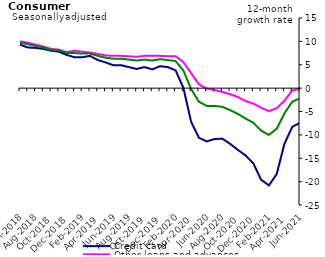
| Category | Credit card | Other loans and advances | Total |
|---|---|---|---|
| Jun-2018 | 9.3 | 10 | 9.7 |
| Jul-2018 | 8.7 | 9.7 | 9.4 |
| Aug-2018 | 8.6 | 9.3 | 9 |
| Sep-2018 | 8.4 | 8.9 | 8.7 |
| Oct-2018 | 8 | 8.4 | 8.2 |
| Nov-2018 | 7.8 | 8.2 | 8.1 |
| Dec-2018 | 7.1 | 7.7 | 7.5 |
| Jan-2019 | 6.6 | 8 | 7.5 |
| Feb-2019 | 6.6 | 7.8 | 7.4 |
| Mar-2019 | 6.9 | 7.6 | 7.4 |
| Apr-2019 | 6 | 7.3 | 6.9 |
| May-2019 | 5.5 | 7 | 6.5 |
| Jun-2019 | 4.9 | 6.9 | 6.3 |
| Jul-2019 | 4.9 | 6.9 | 6.3 |
| Aug-2019 | 4.5 | 6.8 | 6.1 |
| Sep-2019 | 4.1 | 6.7 | 5.9 |
| Oct-2019 | 4.5 | 6.9 | 6.1 |
| Nov-2019 | 4 | 6.9 | 5.9 |
| Dec-2019 | 4.7 | 6.9 | 6.2 |
| Jan-2020 | 4.5 | 6.8 | 6 |
| Feb-2020 | 3.8 | 6.8 | 5.8 |
| Mar-2020 | 0.1 | 5.6 | 3.8 |
| Apr-2020 | -7.2 | 3.2 | -0.2 |
| May-2020 | -10.6 | 0.8 | -2.9 |
| Jun-2020 | -11.4 | -0.1 | -3.8 |
| Jul-2020 | -10.9 | -0.4 | -3.8 |
| Aug-2020 | -10.8 | -0.8 | -4 |
| Sep-2020 | -11.9 | -1.3 | -4.7 |
| Oct-2020 | -13.2 | -1.9 | -5.5 |
| Nov-2020 | -14.4 | -2.8 | -6.5 |
| Dec-2020 | -16.1 | -3.3 | -7.4 |
| Jan-2021 | -19.6 | -4.2 | -9.1 |
| Feb-2021 | -20.8 | -4.9 | -10 |
| Mar-2021 | -18.4 | -4.3 | -8.7 |
| Apr-2021 | -11.9 | -2.7 | -5.4 |
| May-2021 | -8.3 | -0.5 | -2.9 |
| Jun-2021 | -7.4 | -0.1 | -2.2 |